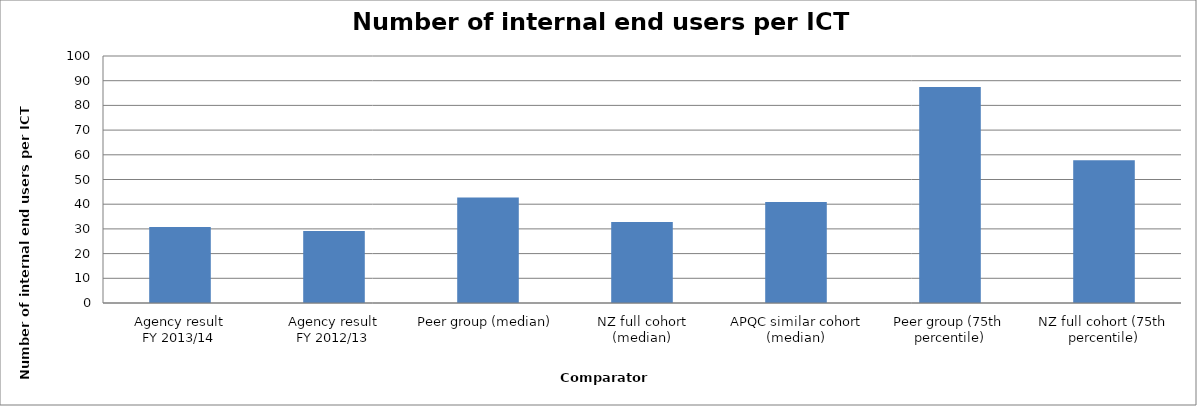
| Category | Result |
|---|---|
| Agency result
FY 2013/14 | 30.788 |
| Agency result
FY 2012/13 | 29.127 |
| Peer group (median) | 42.667 |
| NZ full cohort (median) | 32.819 |
| APQC similar cohort (median) | 40.87 |
| Peer group (75th percentile) | 87.429 |
| NZ full cohort (75th percentile) | 57.783 |